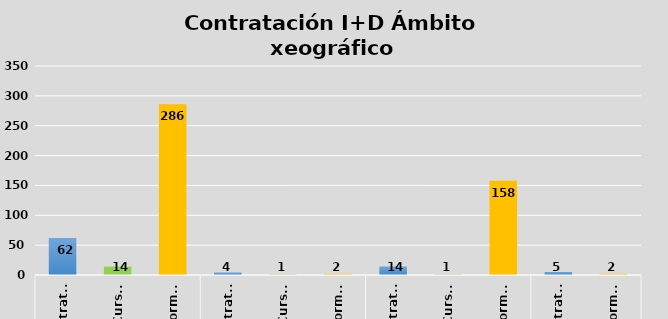
| Category | Series 0 |
|---|---|
| 0 | 62 |
| 1 | 14 |
| 2 | 286 |
| 3 | 4 |
| 4 | 1 |
| 5 | 2 |
| 6 | 14 |
| 7 | 1 |
| 8 | 158 |
| 9 | 5 |
| 10 | 2 |